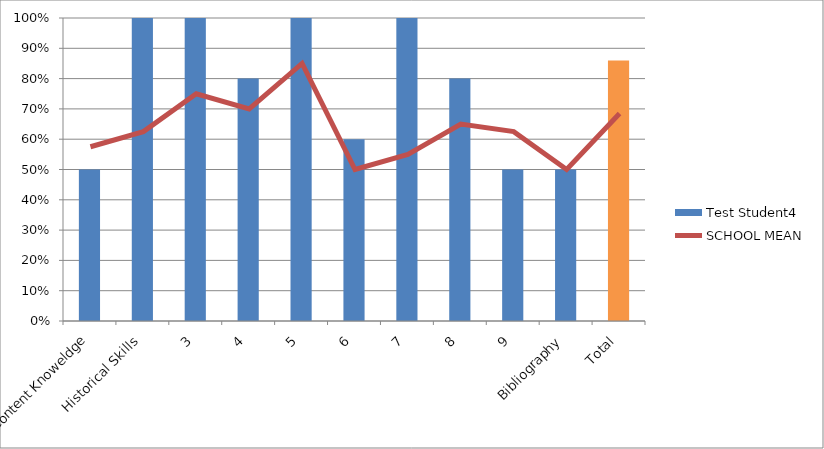
| Category | Test Student4 |
|---|---|
| Content Knoweldge | 0.5 |
| Historical Skills | 1 |
| 3 | 1 |
| 4 | 0.8 |
| 5 | 1 |
| 6 | 0.6 |
| 7 | 1 |
| 8 | 0.8 |
| 9 | 0.5 |
| Bibliography | 0.5 |
| Total | 0.86 |